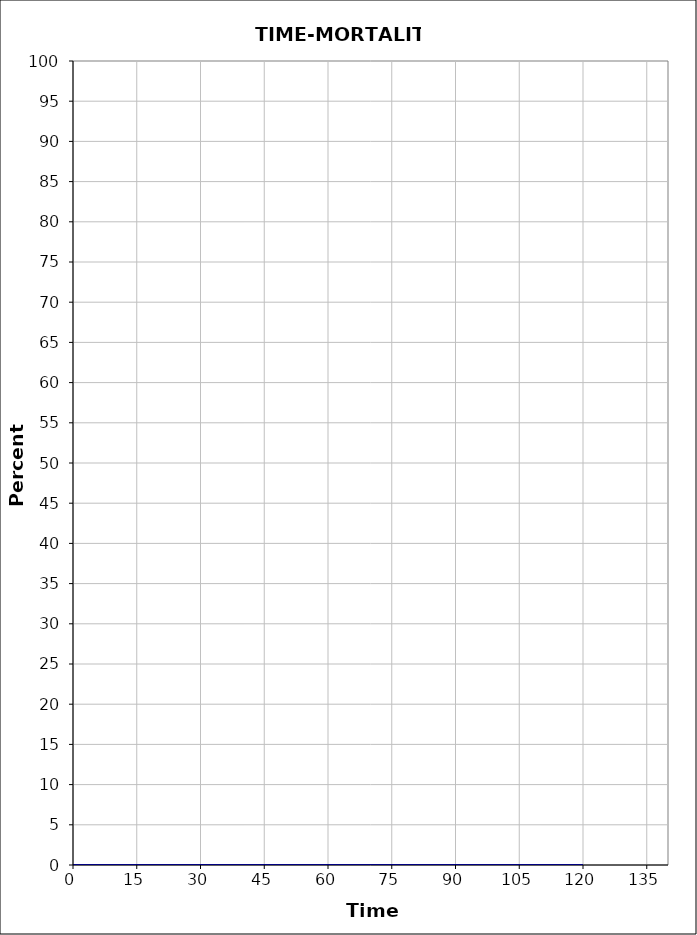
| Category | Series 0 |
|---|---|
| 0.0 | 0 |
| 5.0 | 0 |
| 10.0 | 0 |
| 15.0 | 0 |
| 30.0 | 0 |
| 45.0 | 0 |
| 60.0 | 0 |
| 75.0 | 0 |
| 90.0 | 0 |
| 105.0 | 0 |
| 120.0 | 0 |